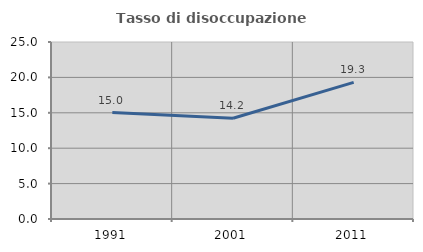
| Category | Tasso di disoccupazione giovanile  |
|---|---|
| 1991.0 | 15.033 |
| 2001.0 | 14.231 |
| 2011.0 | 19.305 |